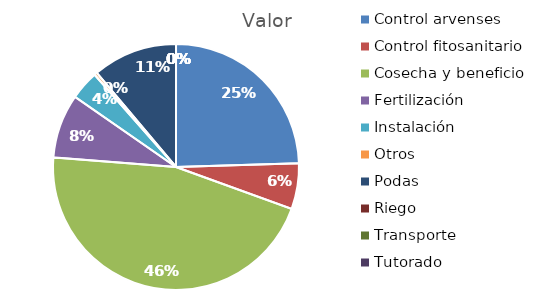
| Category | Valor |
|---|---|
| Control arvenses | 9314309 |
| Control fitosanitario | 2285720 |
| Cosecha y beneficio | 17371472 |
| Fertilización | 3200008 |
| Instalación | 1457146.5 |
| Otros | 142857.5 |
| Podas | 4228582 |
| Riego | 0 |
| Transporte | 0 |
| Tutorado | 0 |